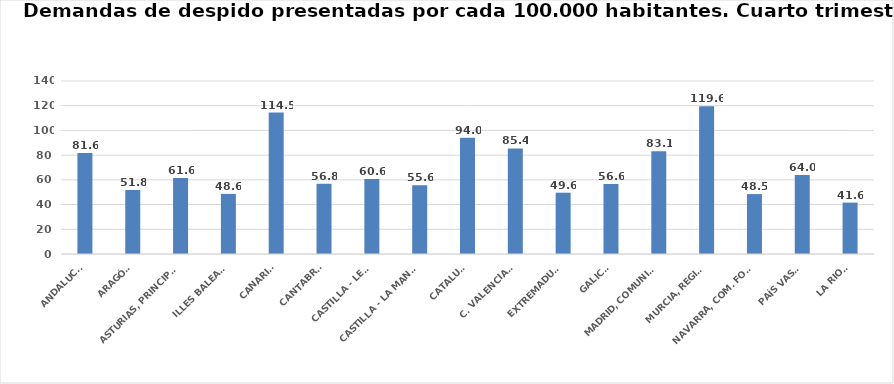
| Category | Series 0 |
|---|---|
| ANDALUCÍA | 81.634 |
| ARAGÓN | 51.804 |
| ASTURIAS, PRINCIPADO | 61.593 |
| ILLES BALEARS | 48.644 |
| CANARIAS | 114.465 |
| CANTABRIA | 56.752 |
| CASTILLA - LEÓN | 60.649 |
| CASTILLA - LA MANCHA | 55.56 |
| CATALUÑA | 94.049 |
| C. VALENCIANA | 85.431 |
| EXTREMADURA | 49.606 |
| GALICIA | 56.636 |
| MADRID, COMUNIDAD | 83.064 |
| MURCIA, REGIÓN | 119.599 |
| NAVARRA, COM. FORAL | 48.497 |
| PAÍS VASCO | 63.967 |
| LA RIOJA | 41.581 |